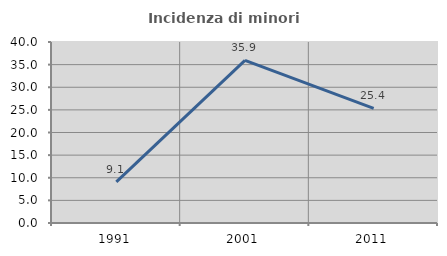
| Category | Incidenza di minori stranieri |
|---|---|
| 1991.0 | 9.091 |
| 2001.0 | 35.928 |
| 2011.0 | 25.351 |